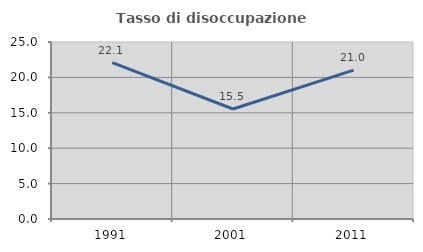
| Category | Tasso di disoccupazione giovanile  |
|---|---|
| 1991.0 | 22.096 |
| 2001.0 | 15.534 |
| 2011.0 | 21.036 |